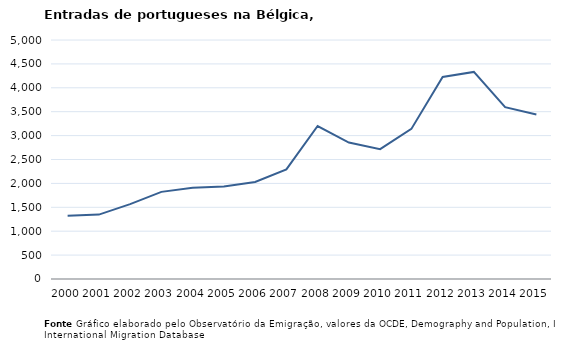
| Category | Entradas |
|---|---|
| 2000.0 | 1324 |
| 2001.0 | 1347 |
| 2002.0 | 1567 |
| 2003.0 | 1823 |
| 2004.0 | 1907 |
| 2005.0 | 1934 |
| 2006.0 | 2030 |
| 2007.0 | 2293 |
| 2008.0 | 3200 |
| 2009.0 | 2854 |
| 2010.0 | 2717 |
| 2011.0 | 3140 |
| 2012.0 | 4228 |
| 2013.0 | 4332 |
| 2014.0 | 3594 |
| 2015.0 | 3442 |